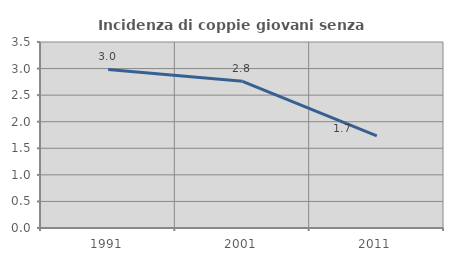
| Category | Incidenza di coppie giovani senza figli |
|---|---|
| 1991.0 | 2.983 |
| 2001.0 | 2.76 |
| 2011.0 | 1.733 |